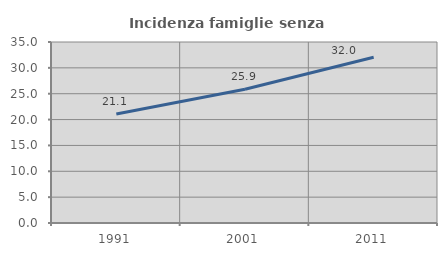
| Category | Incidenza famiglie senza nuclei |
|---|---|
| 1991.0 | 21.062 |
| 2001.0 | 25.879 |
| 2011.0 | 32.036 |